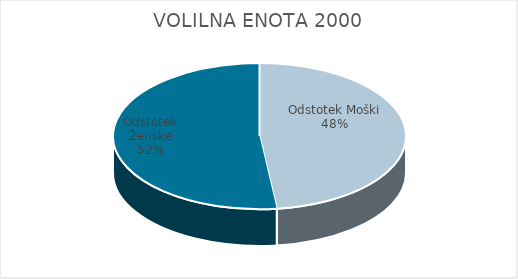
| Category | VOLILNA ENOTA 2000 | #REF! | Slovenija skupaj |
|---|---|---|---|
| Odstotek Moški | 20.11 |  | 19.85 |
| Odstotek Ženske | 21.68 |  | 21.47 |